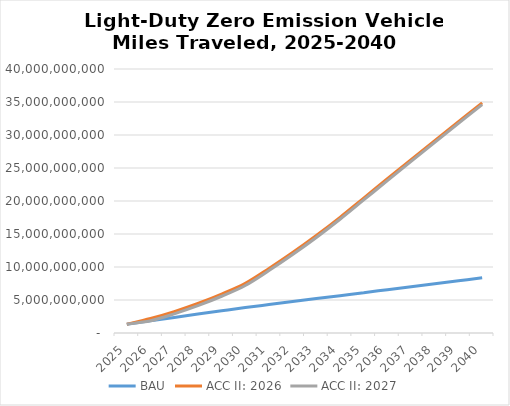
| Category | BAU | ACC II: 2026 | ACC II: 2027 |
|---|---|---|---|
| 2025.0 | 1336292817.791 | 1336292817.791 | 1336292817.791 |
| 2026.0 | 1852175471.579 | 2191924774.413 | 1852175471.579 |
| 2027.0 | 2360860589.937 | 3237025986.993 | 2903506131.858 |
| 2028.0 | 2862893366.782 | 4470061348.571 | 4142492649.167 |
| 2029.0 | 3358787901.604 | 5889710476.324 | 5567831944.181 |
| 2030.0 | 3849012496.169 | 7520268669.829 | 7203835691.776 |
| 2031.0 | 4307290529.827 | 9773514716.238 | 9464696432.31 |
| 2032.0 | 4761610962.612 | 12190388502.475 | 11888771153.906 |
| 2033.0 | 5212559791.312 | 14772779243.655 | 14477981875.807 |
| 2034.0 | 5660670802.608 | 17522665038.37 | 17234335774.661 |
| 2035.0 | 6106401159.695 | 20442008103.058 | 20159822474.701 |
| 2036.0 | 6561415136.366 | 23369587714.137 | 23092688727.473 |
| 2037.0 | 7014601914.29 | 26273103709.695 | 26001239532.27 |
| 2038.0 | 7466301141.442 | 29155495034.219 | 28888431900.696 |
| 2039.0 | 7916850846.907 | 32019544248.322 | 31757063706.669 |
| 2040.0 | 8366524295.312 | 34867650771.295 | 34609549559.047 |